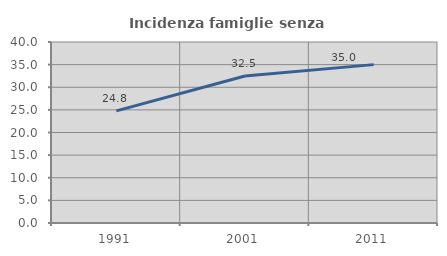
| Category | Incidenza famiglie senza nuclei |
|---|---|
| 1991.0 | 24.79 |
| 2001.0 | 32.489 |
| 2011.0 | 35 |